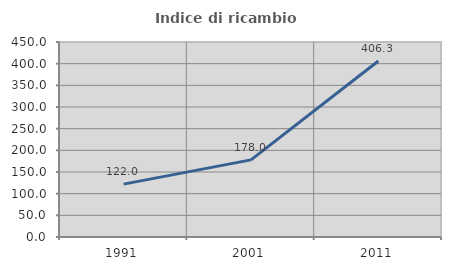
| Category | Indice di ricambio occupazionale  |
|---|---|
| 1991.0 | 121.965 |
| 2001.0 | 178 |
| 2011.0 | 406.283 |